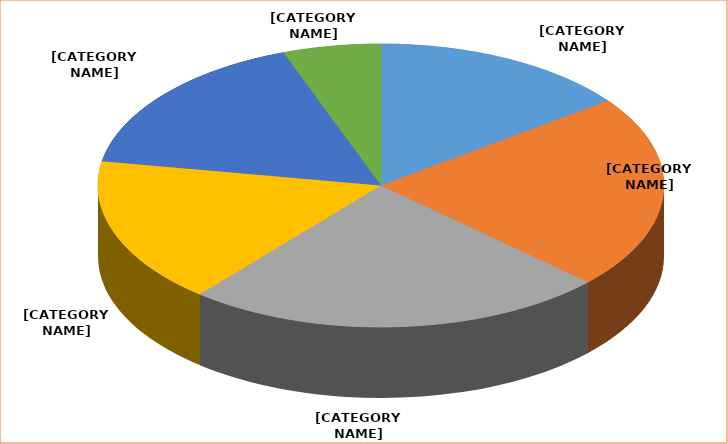
| Category | Series 0 |
|---|---|
| ≤ 30 | 0.148 |
| 31 – 40 | 0.222 |
| 41 – 50 | 0.241 |
| 51 – 60 | 0.167 |
| 61 – 70 | 0.167 |
| > 70 | 0.056 |